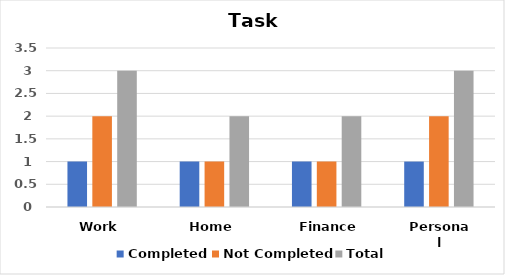
| Category | Completed | Not Completed | Total |
|---|---|---|---|
| Work | 1 | 2 | 3 |
| Home | 1 | 1 | 2 |
| Finance | 1 | 1 | 2 |
| Personal | 1 | 2 | 3 |